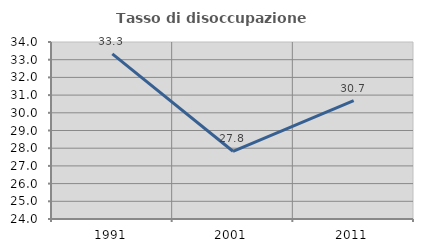
| Category | Tasso di disoccupazione giovanile  |
|---|---|
| 1991.0 | 33.333 |
| 2001.0 | 27.826 |
| 2011.0 | 30.682 |